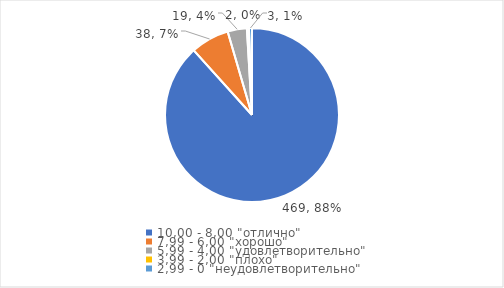
| Category | Series 0 | Series 1 |
|---|---|---|
| 10,00 - 8,00 "отлично" | 469 | 0.883 |
| 7,99 - 6,00 "хорошо" | 38 | 0.072 |
| 5,99 - 4,00 "удовлетворительно" | 19 | 0.036 |
| 3,99 - 2,00 "плохо" | 2 | 0.004 |
| 2,99 - 0 "неудовлетворительно" | 3 | 0.006 |